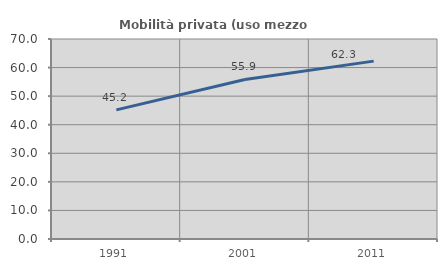
| Category | Mobilità privata (uso mezzo privato) |
|---|---|
| 1991.0 | 45.191 |
| 2001.0 | 55.853 |
| 2011.0 | 62.261 |